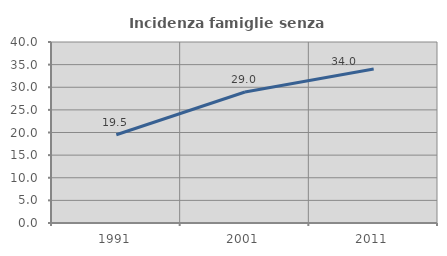
| Category | Incidenza famiglie senza nuclei |
|---|---|
| 1991.0 | 19.495 |
| 2001.0 | 28.959 |
| 2011.0 | 34.04 |